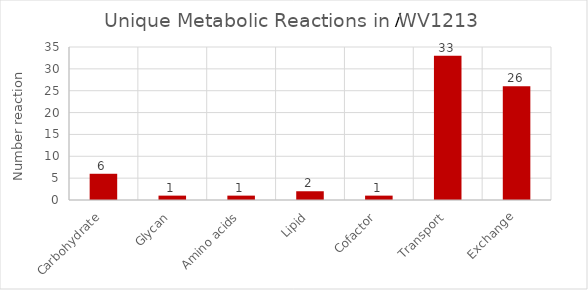
| Category | Series 0 |
|---|---|
| Carbohydrate | 6 |
| Glycan | 1 |
| Amino acids | 1 |
| Lipid | 2 |
| Cofactor | 1 |
| Transport | 33 |
| Exchange | 26 |